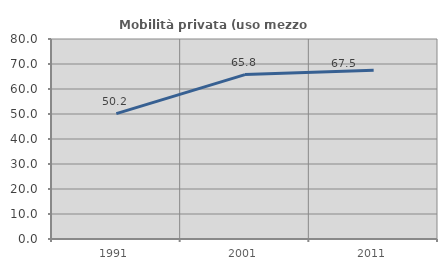
| Category | Mobilità privata (uso mezzo privato) |
|---|---|
| 1991.0 | 50.15 |
| 2001.0 | 65.755 |
| 2011.0 | 67.542 |